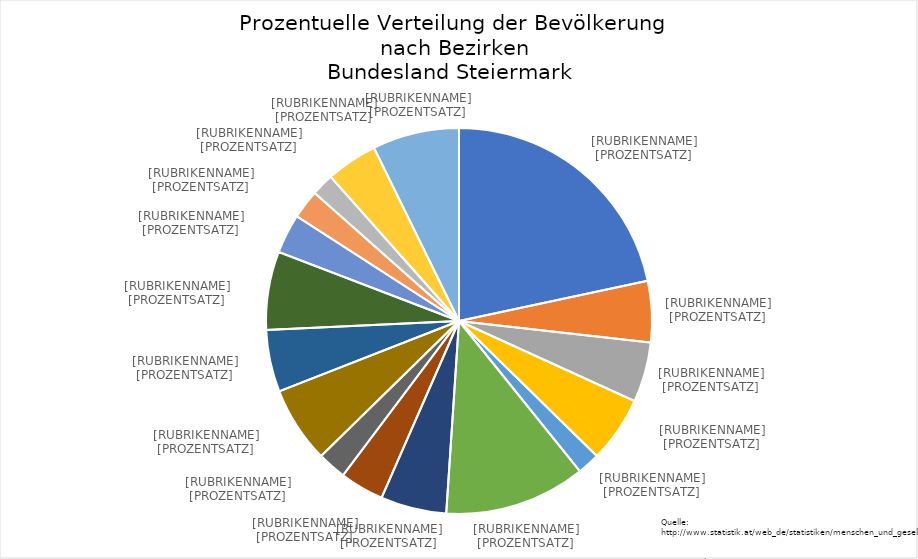
| Category | Series 0 |
|---|---|
| Graz (Stadt) | 0.217 |
| Bruck an der Mur | 0.051 |
| Deutschlandsberg | 0.05 |
| Feldbach | 0.055 |
| Fürstenfeld | 0.019 |
| Graz-Umgebung | 0.118 |
| Hartberg | 0.055 |
| Judenburg | 0.037 |
| Knittelfeld | 0.024 |
| Leibnitz | 0.064 |
| Leoben | 0.052 |
| Liezen | 0.066 |
| Mürzzuschlag | 0.033 |
| Murau | 0.024 |
| Radkersburg | 0.019 |
| Voitsberg | 0.043 |
| Weiz | 0.073 |